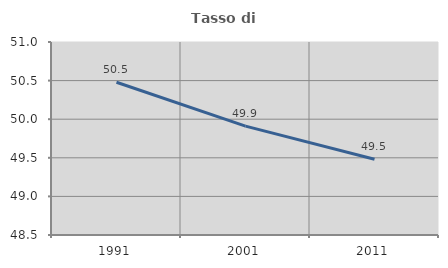
| Category | Tasso di occupazione   |
|---|---|
| 1991.0 | 50.479 |
| 2001.0 | 49.91 |
| 2011.0 | 49.482 |